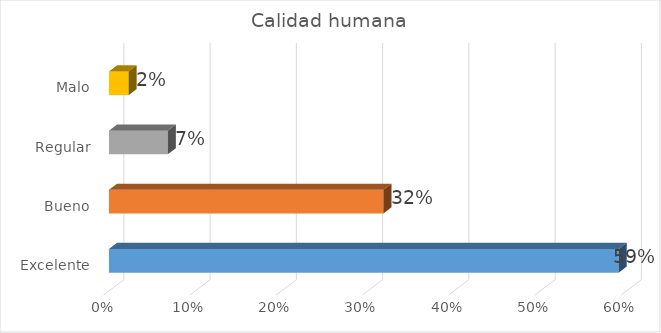
| Category | Series 0 |
|---|---|
| Excelente | 0.591 |
| Bueno | 0.318 |
| Regular | 0.068 |
| Malo | 0.023 |